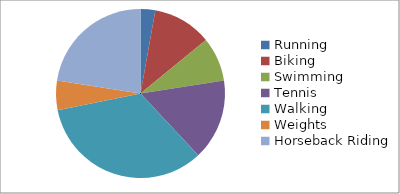
| Category | Series 0 |
|---|---|
| Running | 0.5 |
| Biking | 2 |
| Swimming | 1.5 |
| Tennis | 2.75 |
| Walking | 6 |
| Weights | 1 |
| Horseback Riding | 4 |